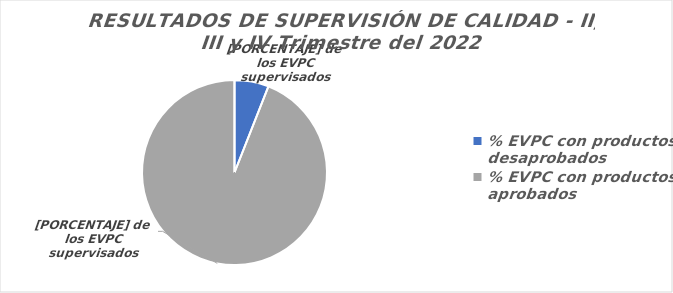
| Category | RESULTADOS DE SUPERVISIÓN DE CALIDAD |
|---|---|
| % EVPC con productos desaprobados | 62 |
| % EVPC con productos aprobados | 976 |